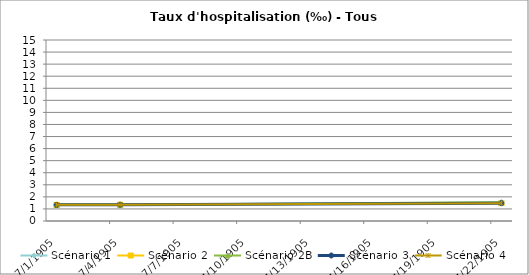
| Category | Scénario 1 | Scénario 2 | Scénario 2B | Scénario 3 | Scénario 4 |
|---|---|---|---|---|---|
| 2009.0 | 1.337 | 1.337 | 1.337 | 1.337 | 1.337 |
| 2012.0 | 1.35 | 1.35 | 1.35 | 1.35 | 1.35 |
| 2030.0 | 1.556 | 1.479 | 1.556 | 1.479 | 1.479 |